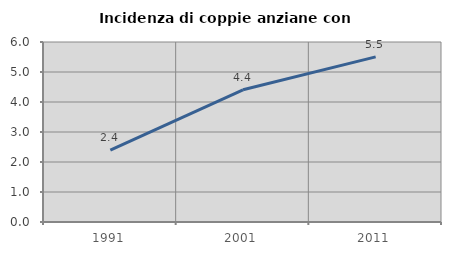
| Category | Incidenza di coppie anziane con figli |
|---|---|
| 1991.0 | 2.398 |
| 2001.0 | 4.408 |
| 2011.0 | 5.505 |